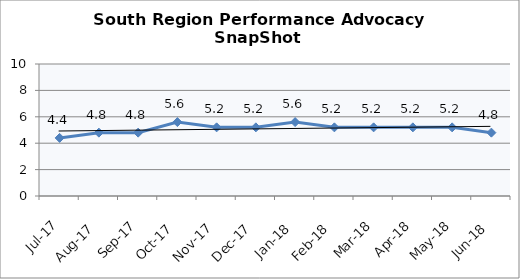
| Category | South Region |
|---|---|
| Jul-17 | 4.4 |
| Aug-17 | 4.8 |
| Sep-17 | 4.8 |
| Oct-17 | 5.6 |
| Nov-17 | 5.2 |
| Dec-17 | 5.2 |
| Jan-18 | 5.6 |
| Feb-18 | 5.2 |
| Mar-18 | 5.2 |
| Apr-18 | 5.2 |
| May-18 | 5.2 |
| Jun-18 | 4.8 |